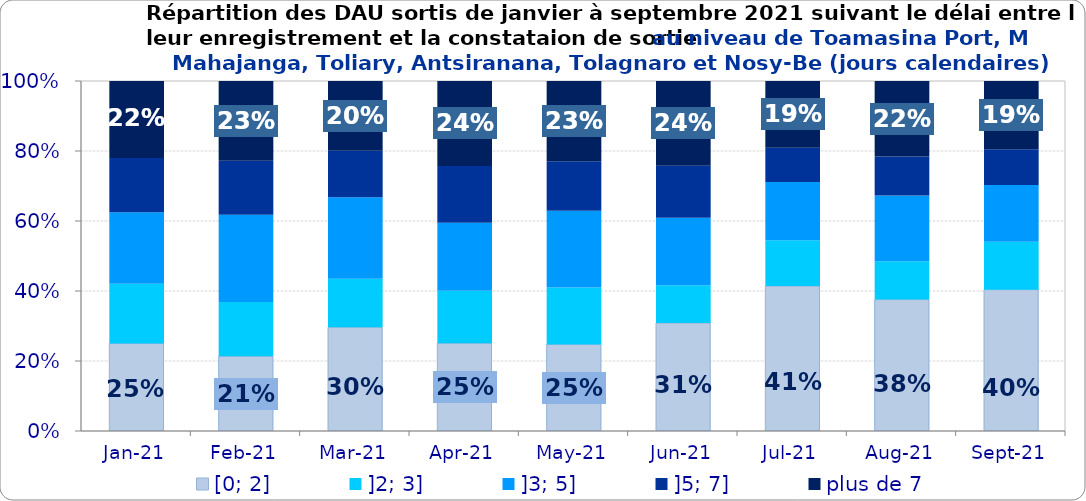
| Category | [0; 2] | ]2; 3] | ]3; 5] | ]5; 7] | plus de 7 |
|---|---|---|---|---|---|
| 2021-01-01 | 0.25 | 0.17 | 0.204 | 0.155 | 0.22 |
| 2021-02-01 | 0.213 | 0.155 | 0.249 | 0.155 | 0.228 |
| 2021-03-01 | 0.296 | 0.139 | 0.233 | 0.133 | 0.199 |
| 2021-04-01 | 0.25 | 0.151 | 0.194 | 0.162 | 0.243 |
| 2021-05-01 | 0.247 | 0.163 | 0.219 | 0.141 | 0.23 |
| 2021-06-01 | 0.308 | 0.108 | 0.193 | 0.149 | 0.242 |
| 2021-07-01 | 0.414 | 0.131 | 0.166 | 0.098 | 0.191 |
| 2021-08-01 | 0.375 | 0.109 | 0.188 | 0.112 | 0.215 |
| 2021-09-01 | 0.404 | 0.137 | 0.163 | 0.102 | 0.195 |